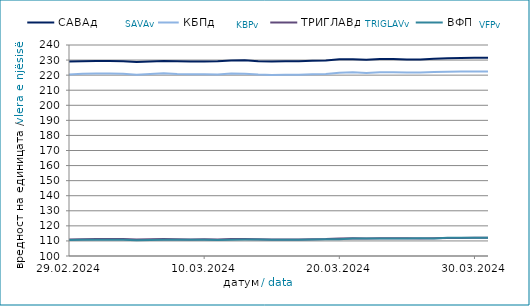
| Category | САВАд | КБПд | ТРИГЛАВд | ВФПд |
|---|---|---|---|---|
| 2024-02-29 | 229.013 | 220.45 | 110.953 | 110.545 |
| 2024-03-01 | 229.248 | 220.992 | 111.182 | 110.752 |
| 2024-03-02 | 229.324 | 221.081 | 111.223 | 110.771 |
| 2024-03-03 | 229.334 | 221.091 | 111.229 | 110.778 |
| 2024-03-04 | 229.223 | 220.985 | 111.199 | 110.787 |
| 2024-03-05 | 228.691 | 220.279 | 110.893 | 110.526 |
| 2024-03-06 | 229.051 | 220.757 | 111.086 | 110.638 |
| 2024-03-07 | 229.404 | 221.222 | 111.319 | 110.774 |
| 2024-03-08 | 229.251 | 220.744 | 111.116 | 110.752 |
| 2024-03-09 | 229.076 | 220.555 | 111.028 | 110.729 |
| 2024-03-10 | 229.087 | 220.565 | 111.034 | 110.736 |
| 2024-03-11 | 229.269 | 220.356 | 110.965 | 110.572 |
| 2024-03-12 | 229.654 | 221.016 | 111.258 | 110.819 |
| 2024-03-13 | 229.802 | 220.977 | 111.269 | 110.874 |
| 2024-03-14 | 229.266 | 220.41 | 111.06 | 110.871 |
| 2024-03-15 | 229.061 | 220.112 | 110.924 | 110.727 |
| 2024-03-16 | 229.214 | 220.277 | 111.006 | 110.751 |
| 2024-03-17 | 229.225 | 220.288 | 111.012 | 110.758 |
| 2024-03-18 | 229.518 | 220.591 | 111.119 | 110.967 |
| 2024-03-19 | 229.673 | 220.821 | 111.25 | 111.047 |
| 2024-03-20 | 230.472 | 221.662 | 111.641 | 111.151 |
| 2024-03-21 | 230.613 | 221.975 | 111.765 | 111.65 |
| 2024-03-22 | 230.201 | 221.474 | 111.545 | 111.601 |
| 2024-03-23 | 230.644 | 221.946 | 111.778 | 111.676 |
| 2024-03-24 | 230.654 | 221.957 | 111.784 | 111.683 |
| 2024-03-25 | 230.429 | 221.835 | 111.715 | 111.628 |
| 2024-03-26 | 230.444 | 221.734 | 111.65 | 111.699 |
| 2024-03-27 | 230.896 | 222.02 | 111.834 | 111.672 |
| 2024-03-28 | 231.288 | 222.281 | 111.944 | 112.084 |
| 2024-03-29 | 231.391 | 222.336 | 111.979 | 112.126 |
| 2024-03-30 | 231.495 | 222.442 | 112.036 | 112.139 |
| 2024-03-31 | 231.505 | 222.453 | 112.042 | 112.145 |